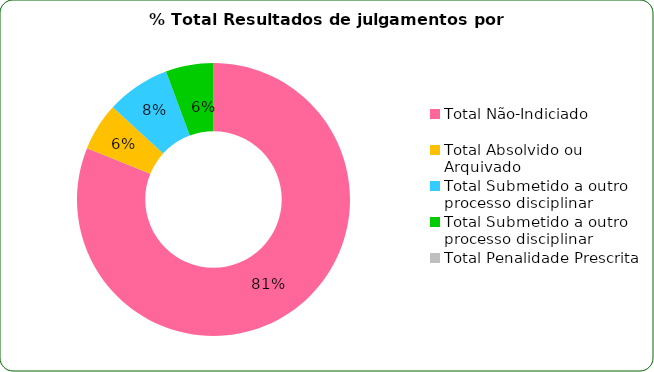
| Category | % Total |
|---|---|
| Total Não-Indiciado | 0.811 |
| Total Absolvido ou Arquivado | 0.057 |
| Total Submetido a outro processo disciplinar | 0.075 |
| Total Submetido a outro processo disciplinar | 0.057 |
| Total Penalidade Prescrita | 0 |